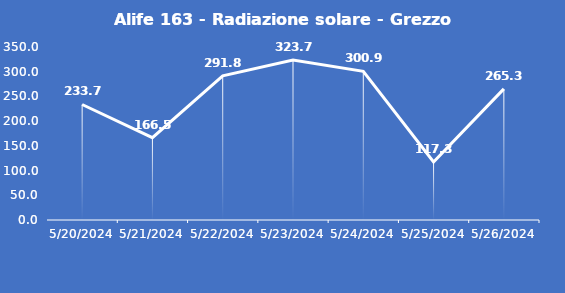
| Category | Alife 163 - Radiazione solare - Grezzo (W/m2) |
|---|---|
| 5/20/24 | 233.7 |
| 5/21/24 | 166.5 |
| 5/22/24 | 291.8 |
| 5/23/24 | 323.7 |
| 5/24/24 | 300.9 |
| 5/25/24 | 117.3 |
| 5/26/24 | 265.3 |